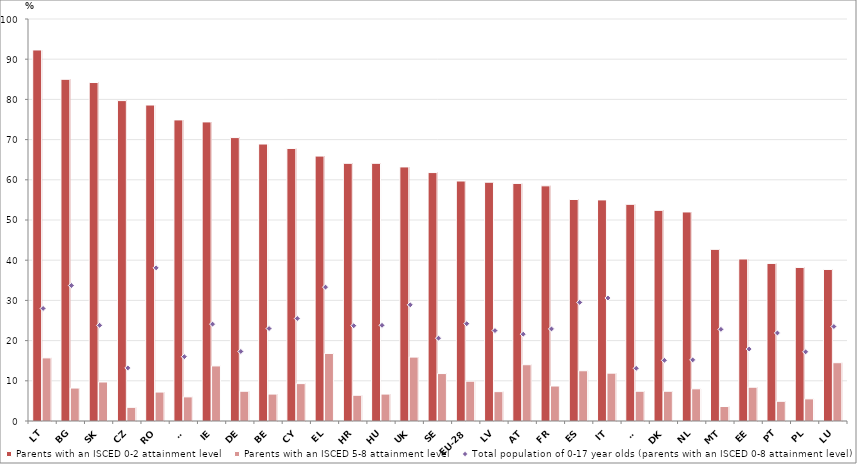
| Category | Parents with an ISCED 0-2 attainment level | Parents with an ISCED 5-8 attainment level |
|---|---|---|
| LT | 92.3 | 15.7 |
| BG | 85 | 8.2 |
| SK | 84.2 | 9.7 |
| CZ | 79.7 | 3.4 |
| RO | 78.6 | 7.2 |
| FI | 74.9 | 6 |
| IE | 74.4 | 13.7 |
| DE | 70.5 | 7.4 |
| BE | 68.9 | 6.7 |
| CY | 67.8 | 9.3 |
| EL | 65.9 | 16.8 |
| HR | 64.1 | 6.4 |
| HU | 64.1 | 6.7 |
| UK | 63.2 | 15.9 |
| SE | 61.8 | 11.8 |
| EU-28 | 59.7 | 9.9 |
| LV | 59.4 | 7.3 |
| AT | 59.1 | 14 |
| FR | 58.5 | 8.7 |
| ES | 55.1 | 12.5 |
| IT | 55 | 11.9 |
| SI | 53.9 | 7.4 |
| DK | 52.4 | 7.4 |
| NL | 52 | 8 |
| MT | 42.7 | 3.6 |
| EE | 40.3 | 8.4 |
| PT | 39.2 | 4.9 |
| PL | 38.2 | 5.5 |
| LU | 37.7 | 14.5 |